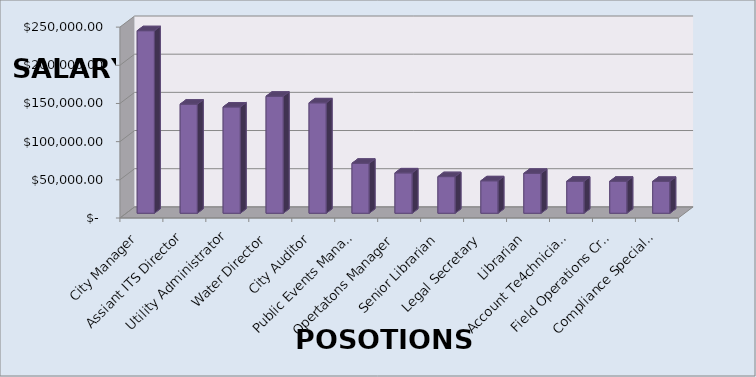
| Category | Series 0 |
|---|---|
| City Manager | 239057.725 |
| Assiant ITS Director | 142877.595 |
| Utility Administrator | 139190.37 |
| Water Director | 153240.88 |
| City Auditor | 144609.92 |
| Public Events Manager | 65418.44 |
| Opertatons Manager | 52862.885 |
| Senior Librarian | 47947.64 |
| Legal Secretary | 42505.95 |
| Librarian | 52241.28 |
| Account Te4chnicialist | 41901.6 |
| Field Operations Crewleader | 41879.76 |
| Compliance Specialist | 41771.6 |